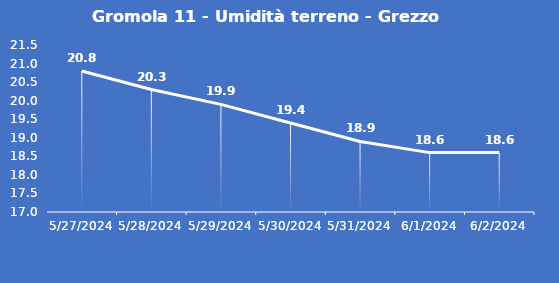
| Category | Gromola 11 - Umidità terreno - Grezzo (%VWC) |
|---|---|
| 5/27/24 | 20.8 |
| 5/28/24 | 20.3 |
| 5/29/24 | 19.9 |
| 5/30/24 | 19.4 |
| 5/31/24 | 18.9 |
| 6/1/24 | 18.6 |
| 6/2/24 | 18.6 |